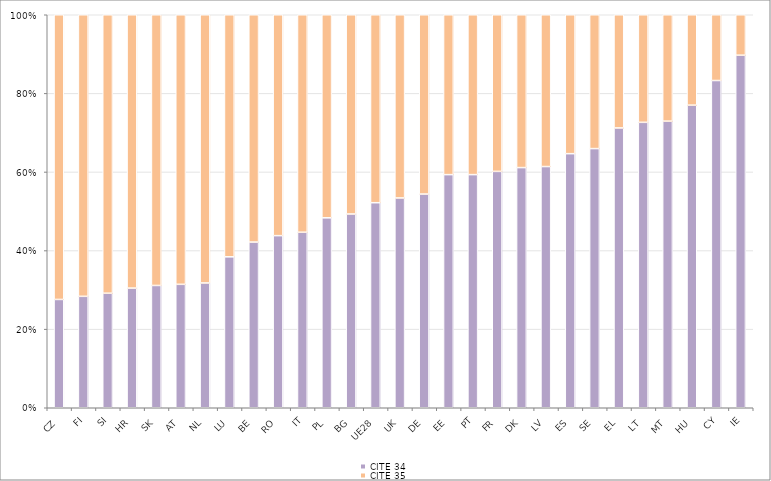
| Category | CITE 34 | CITE 35 |
|---|---|---|
| CZ | 27.558 | 72.442 |
| FI | 28.354 | 71.646 |
| SI | 29.141 | 70.859 |
| HR | 30.45 | 69.55 |
| SK | 31.117 | 68.883 |
| AT | 31.406 | 68.594 |
| NL | 31.754 | 68.246 |
| LU | 38.405 | 61.595 |
| BE | 42.157 | 57.843 |
| RO | 43.795 | 56.205 |
| IT | 44.66 | 55.34 |
| PL | 48.329 | 51.671 |
| BG | 49.298 | 50.702 |
| UE28 | 52.176 | 47.824 |
| UK | 53.38 | 46.62 |
| DE | 54.374 | 45.626 |
| EE | 59.32 | 40.68 |
| PT | 59.324 | 40.676 |
| FR | 60.146 | 39.854 |
| DK | 61.114 | 38.886 |
| LV | 61.376 | 38.624 |
| ES | 64.651 | 35.349 |
| SE | 65.946 | 34.054 |
| EL | 71.196 | 28.804 |
| LT | 72.629 | 27.371 |
| MT | 72.925 | 27.075 |
| HU | 76.999 | 23.001 |
| CY | 83.268 | 16.732 |
| IE | 89.707 | 10.293 |